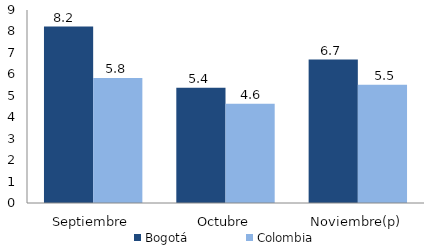
| Category | Bogotá | Colombia |
|---|---|---|
| Septiembre | 8.229 | 5.829 |
| Octubre | 5.371 | 4.631 |
| Noviembre(p) | 6.686 | 5.519 |